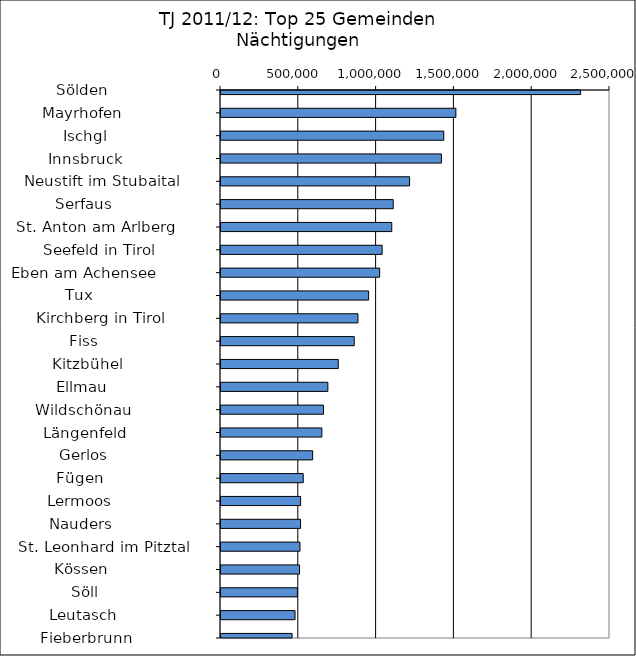
| Category | Series 0 |
|---|---|
|   Sölden                     | 2310983 |
|   Mayrhofen                  | 1509456 |
|   Ischgl                     | 1431922 |
|   Innsbruck                  | 1416504 |
|   Neustift im Stubaital      | 1211988 |
|   Serfaus                    | 1106888 |
|   St. Anton am Arlberg       | 1097517 |
|   Seefeld in Tirol           | 1035647 |
|   Eben am Achensee           | 1019588 |
|   Tux                        | 948760 |
|   Kirchberg in Tirol         | 880205 |
|   Fiss                       | 856349 |
|   Kitzbühel                  | 753568 |
|   Ellmau                     | 686670 |
|   Wildschönau                | 658777 |
|   Längenfeld                 | 648296 |
|   Gerlos                     | 589069 |
|   Fügen                      | 528409 |
|   Lermoos                    | 511662 |
|   Nauders                    | 511499 |
|   St. Leonhard im Pitztal    | 507459 |
|   Kössen                     | 504980 |
|   Söll                       | 491200 |
|   Leutasch                   | 475760 |
|   Fieberbrunn                | 456900 |